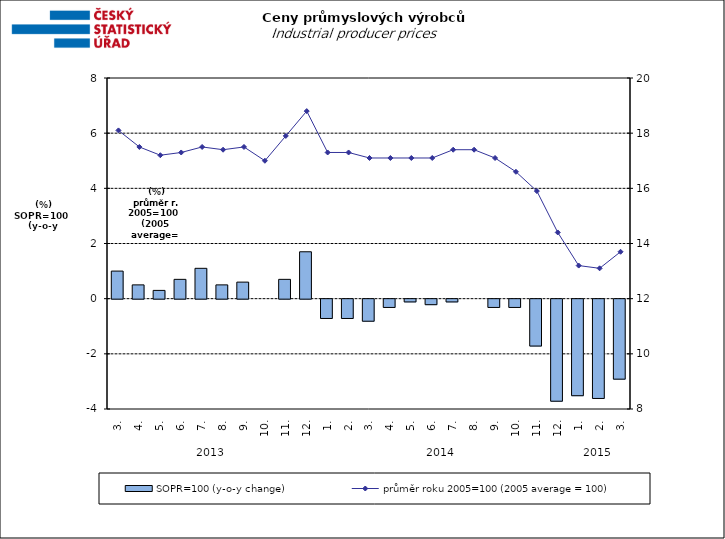
| Category | SOPR=100 (y-o-y change)   |
|---|---|
| 0 | 1 |
| 1 | 0.5 |
| 2 | 0.3 |
| 3 | 0.7 |
| 4 | 1.1 |
| 5 | 0.5 |
| 6 | 0.6 |
| 7 | 0 |
| 8 | 0.7 |
| 9 | 1.7 |
| 10 | -0.7 |
| 11 | -0.7 |
| 12 | -0.8 |
| 13 | -0.3 |
| 14 | -0.1 |
| 15 | -0.2 |
| 16 | -0.1 |
| 17 | 0 |
| 18 | -0.3 |
| 19 | -0.3 |
| 20 | -1.7 |
| 21 | -3.7 |
| 22 | -3.5 |
| 23 | -3.6 |
| 24 | -2.9 |